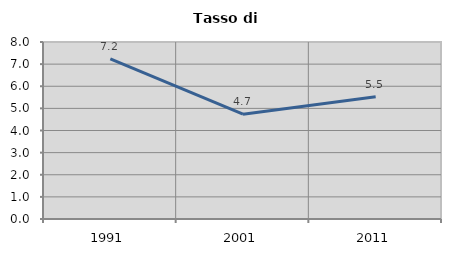
| Category | Tasso di disoccupazione   |
|---|---|
| 1991.0 | 7.237 |
| 2001.0 | 4.737 |
| 2011.0 | 5.53 |